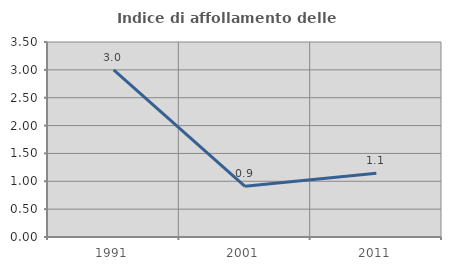
| Category | Indice di affollamento delle abitazioni  |
|---|---|
| 1991.0 | 3 |
| 2001.0 | 0.909 |
| 2011.0 | 1.146 |